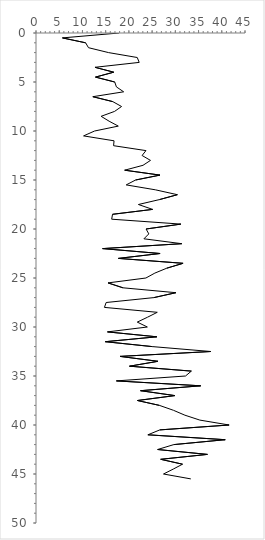
| Category | Series 0 |
|---|---|
| 17.88888888888889 | 0 |
| 5.690131124913734 | 0.5 |
| 10.683760683760683 | 1 |
| 11.302541544477029 | 1.5 |
| 15.62881562881563 | 2 |
| 21.7989417989418 | 2.5 |
| 22.222222222222225 | 3 |
| 12.70188221007893 | 3.5 |
| 16.73469387755102 | 4 |
| 12.810457516339872 | 4.5 |
| 16.95156695156695 | 5 |
| 17.31313131313131 | 5.5 |
| 18.876518218623485 | 6 |
| 12.236652236652239 | 6.5 |
| 16.524644945697577 | 7 |
| 18.42377260981912 | 7.5 |
| 16.91919191919192 | 8 |
| 14.02116402116402 | 8.5 |
| 15.74074074074074 | 9 |
| 17.717952052716004 | 9.5 |
| 12.61437908496732 | 10 |
| 10.241841491841493 | 10.5 |
| 16.806829765545363 | 11 |
| 16.702279202279204 | 11.5 |
| 23.674242424242426 | 12 |
| 22.843822843822846 | 12.5 |
| 24.650349650349654 | 13 |
| 23.039591315453382 | 13.5 |
| 19.09090909090909 | 14 |
| 26.691729323308266 | 14.5 |
| 21.444326133252204 | 15 |
| 19.42439862542955 | 15.5 |
| 25.69916855631141 | 16 |
| 30.44332210998878 | 16.5 |
| 26.574074074074076 | 17 |
| 22.051282051282055 | 17.5 |
| 25.10822510822511 | 18 |
| 16.47727272727273 | 18.5 |
| 16.296296296296294 | 19 |
| 31.19047619047619 | 19.5 |
| 23.703703703703706 | 20 |
| 24.28571428571429 | 20.5 |
| 23.237529938560865 | 21 |
| 31.38888888888889 | 21.5 |
| 14.343434343434344 | 22 |
| 26.716791979949875 | 22.5 |
| 17.74327122153209 | 23 |
| 31.666666666666668 | 23.5 |
| 28.15452091767881 | 24 |
| 25.589225589225588 | 24.5 |
| 23.663957874484193 | 25 |
| 15.50887021475257 | 25.5 |
| 18.724696356275306 | 26 |
| 30.13310914950259 | 26.5 |
| 25.384615384615387 | 27 |
| 15.102149312675628 | 27.5 |
| 14.737945492662476 | 28 |
| 26.111111111111114 | 28.5 |
| 24.019607843137255 | 29 |
| 21.80509047461837 | 29.5 |
| 23.973895113600992 | 30 |
| 15.383028802989493 | 30.5 |
| 26.01010101010101 | 31 |
| 14.92334825668159 | 31.5 |
| 25.048100048100043 | 32 |
| 37.62626262626262 | 32.5 |
| 18.086341832870488 | 33 |
| 26.267056530214422 | 33.5 |
| 20.134680134680135 | 34 |
| 33.44988344988345 | 34.5 |
| 32.19298245614035 | 35 |
| 17.306509166974283 | 35.5 |
| 35.45454545454546 | 36 |
| 22.507122507122507 | 36.5 |
| 29.8989898989899 | 37 |
| 21.843434343434343 | 37.5 |
| 26.581196581196583 | 38 |
| 29.60030165912519 | 38.5 |
| 32.06150073102862 | 39 |
| 35.281385281385276 | 39.5 |
| 41.581196581196586 | 40 |
| 26.666666666666668 | 40.5 |
| 24.090909090909093 | 41 |
| 40.74074074074074 | 41.5 |
| 29.671717171717177 | 42 |
| 26.190476190476193 | 42.5 |
| 36.904761904761905 | 43 |
| 26.85185185185185 | 43.5 |
| 31.547619047619047 | 44 |
| 29.545454545454547 | 44.5 |
| 27.449392712550605 | 45 |
| 33.333333333333336 | 45.5 |